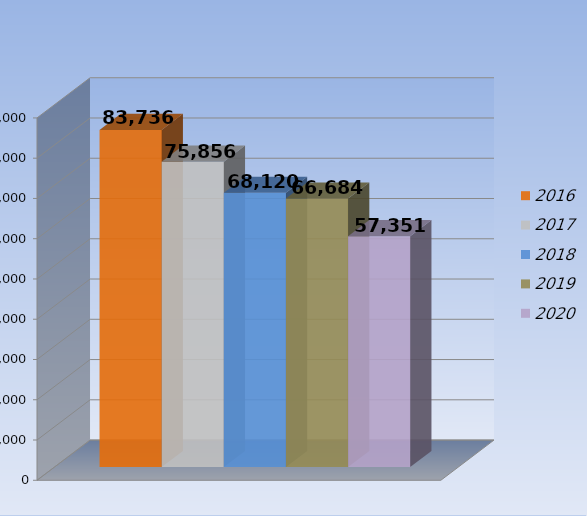
| Category | 2016 | 2017 | 2018 | 2019 | 2020 |
|---|---|---|---|---|---|
| 0 | 83736 | 75856 | 68120 | 66684 | 57351 |